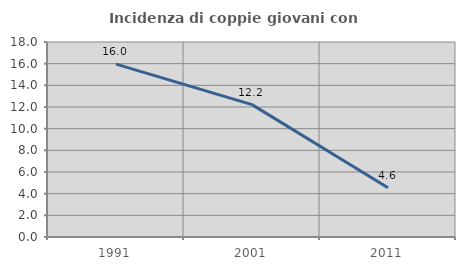
| Category | Incidenza di coppie giovani con figli |
|---|---|
| 1991.0 | 15.957 |
| 2001.0 | 12.217 |
| 2011.0 | 4.555 |